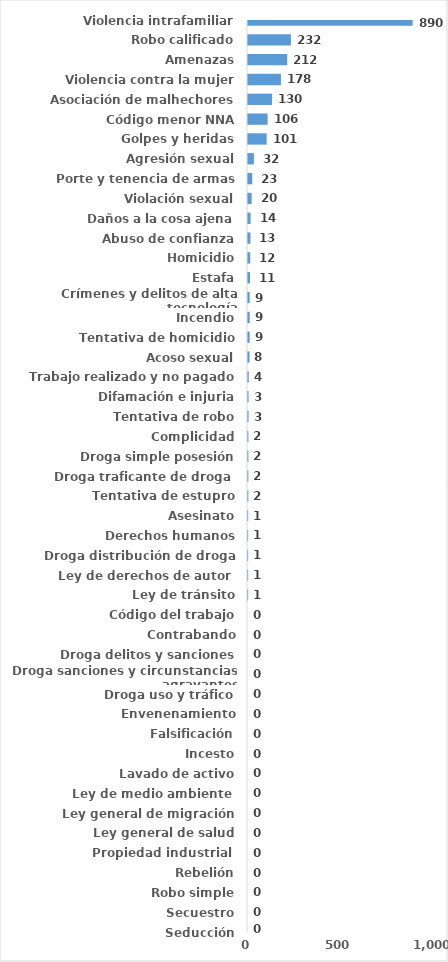
| Category | Series 0 |
|---|---|
| Violencia intrafamiliar | 890 |
| Robo calificado | 232 |
| Amenazas | 212 |
| Violencia contra la mujer | 178 |
| Asociación de malhechores | 130 |
| Código menor NNA | 106 |
| Golpes y heridas | 101 |
| Agresión sexual | 32 |
| Porte y tenencia de armas | 23 |
| Violación sexual | 20 |
| Daños a la cosa ajena | 14 |
| Abuso de confianza | 13 |
| Homicidio | 12 |
| Estafa | 11 |
| Crímenes y delitos de alta tecnología | 9 |
| Incendio | 9 |
| Tentativa de homicidio | 9 |
| Acoso sexual | 8 |
| Trabajo realizado y no pagado | 4 |
| Difamación e injuria | 3 |
| Tentativa de robo | 3 |
| Complicidad | 2 |
| Droga simple posesión | 2 |
| Droga traficante de droga  | 2 |
| Tentativa de estupro | 2 |
| Asesinato | 1 |
| Derechos humanos | 1 |
| Droga distribución de droga | 1 |
| Ley de derechos de autor  | 1 |
| Ley de tránsito | 1 |
| Código del trabajo | 0 |
| Contrabando | 0 |
| Droga delitos y sanciones | 0 |
| Droga sanciones y circunstancias agravantes | 0 |
| Droga uso y tráfico | 0 |
| Envenenamiento | 0 |
| Falsificación | 0 |
| Incesto | 0 |
| Lavado de activo | 0 |
| Ley de medio ambiente  | 0 |
| Ley general de migración | 0 |
| Ley general de salud | 0 |
| Propiedad industrial  | 0 |
| Rebelión | 0 |
| Robo simple | 0 |
| Secuestro | 0 |
| Seducción | 0 |